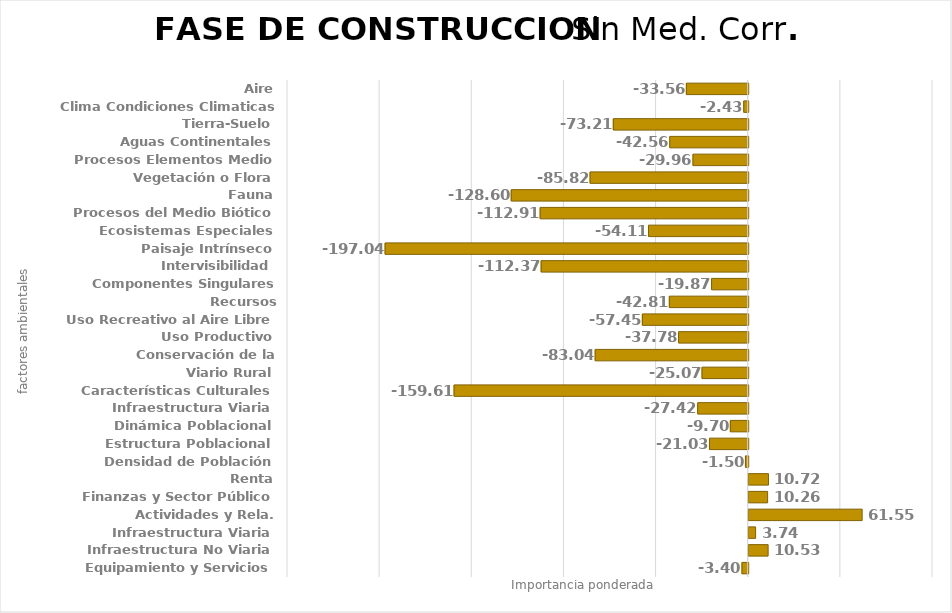
| Category | Series 0 |
|---|---|
| Aire | -33.564 |
| Clima Condiciones Climaticas | -2.432 |
| Tierra-Suelo | -73.208 |
| Aguas Continentales | -42.563 |
| Procesos Elementos Medio | -29.964 |
| Vegetación o Flora | -85.819 |
| Fauna | -128.603 |
| Procesos del Medio Biótico | -112.907 |
| Ecosistemas Especiales | -54.112 |
| Paisaje Intrínseco | -197.044 |
| Intervisibilidad | -112.366 |
| Componentes Singulares Paisaje | -19.874 |
| Recursos Científico-Culturales | -42.806 |
| Uso Recreativo al Aire Libre | -57.448 |
| Uso Productivo | -37.776 |
| Conservación de la Naturaleza | -83.038 |
| Viario Rural | -25.068 |
| Características Culturales | -159.614 |
| Infraestructura Viaria | -27.418 |
| Dinámica Poblacional | -9.7 |
| Estructura Poblacional | -21.028 |
| Densidad de Población | -1.502 |
| Renta | 10.725 |
| Finanzas y Sector Público | 10.259 |
| Actividades y Rela. Económicas | 61.551 |
| Infraestructura Viaria | 3.737 |
| Infraestructura No Viaria | 10.532 |
| Equipamiento y Servicios | -3.397 |